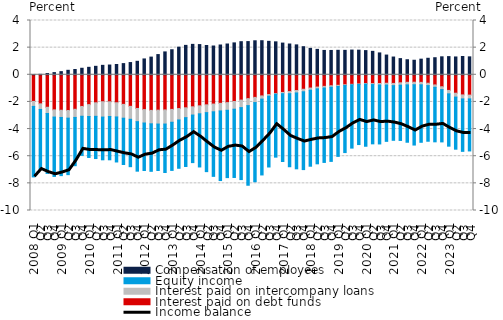
| Category | Interest paid on debt funds | Interest paid on intercompany loans | Equity income | Compensation of employees |
|---|---|---|---|---|
| 2008 Q1 | -1.965 | -0.365 | -5.195 | 0.012 |
| Q2 | -2.142 | -0.413 | -4.421 | 0.031 |
| Q3 | -2.394 | -0.458 | -4.415 | 0.095 |
| Q4 | -2.585 | -0.531 | -4.374 | 0.159 |
| 2009 Q1 | -2.612 | -0.532 | -4.287 | 0.231 |
| Q2 | -2.631 | -0.564 | -4.163 | 0.33 |
| Q3 | -2.543 | -0.6 | -3.555 | 0.388 |
| Q4 | -2.334 | -0.721 | -2.886 | 0.48 |
| 2010 Q1 | -2.199 | -0.875 | -3.018 | 0.55 |
| Q2 | -2.063 | -0.998 | -3.111 | 0.624 |
| Q3 | -1.987 | -1.13 | -3.149 | 0.696 |
| Q4 | -1.991 | -1.081 | -3.192 | 0.719 |
| 2011 Q1 | -2.061 | -1.046 | -3.317 | 0.758 |
| Q2 | -2.18 | -1.02 | -3.411 | 0.824 |
| Q3 | -2.326 | -0.953 | -3.492 | 0.902 |
| Q4 | -2.48 | -0.973 | -3.648 | 0.993 |
| 2012 Q1 | -2.565 | -0.988 | -3.499 | 1.168 |
| Q2 | -2.622 | -0.99 | -3.5 | 1.303 |
| Q3 | -2.606 | -1.024 | -3.421 | 1.489 |
| Q4 | -2.589 | -1.042 | -3.57 | 1.686 |
| 2013 Q1 | -2.551 | -0.948 | -3.547 | 1.844 |
| Q2 | -2.489 | -0.839 | -3.56 | 2.034 |
| Q3 | -2.434 | -0.724 | -3.598 | 2.167 |
| Q4 | -2.359 | -0.607 | -3.505 | 2.241 |
| 2014 Q1 | -2.29 | -0.586 | -3.916 | 2.226 |
| Q2 | -2.215 | -0.573 | -4.348 | 2.16 |
| Q3 | -2.157 | -0.57 | -4.757 | 2.12 |
| Q4 | -2.103 | -0.561 | -5.129 | 2.195 |
| 2015 Q1 | -2.052 | -0.564 | -4.961 | 2.268 |
| Q2 | -1.969 | -0.566 | -5.031 | 2.35 |
| Q3 | -1.866 | -0.554 | -5.302 | 2.439 |
| Q4 | -1.756 | -0.516 | -5.867 | 2.446 |
| 2016 Q1 | -1.666 | -0.381 | -5.836 | 2.506 |
| Q2 | -1.557 | -0.235 | -5.588 | 2.511 |
| Q3 | -1.458 | -0.118 | -5.218 | 2.465 |
| Q4 | -1.386 | -0.041 | -4.642 | 2.428 |
| 2017 Q1 | -1.302 | -0.092 | -4.996 | 2.336 |
| Q2 | -1.239 | -0.155 | -5.382 | 2.268 |
| Q3 | -1.161 | -0.177 | -5.592 | 2.204 |
| Q4 | -1.066 | -0.185 | -5.734 | 2.069 |
| 2018 Q1 | -0.978 | -0.157 | -5.602 | 1.943 |
| Q2 | -0.905 | -0.131 | -5.525 | 1.872 |
| Q3 | -0.854 | -0.122 | -5.482 | 1.794 |
| Q4 | -0.806 | -0.111 | -5.465 | 1.793 |
| 2019 Q1 | -0.775 | -0.09 | -5.148 | 1.804 |
| Q2 | -0.732 | -0.06 | -4.94 | 1.801 |
| Q3 | -0.702 | -0.038 | -4.662 | 1.821 |
| Q4 | -0.675 | -0.033 | -4.433 | 1.815 |
| 2020 Q1 | -0.644 | -0.042 | -4.58 | 1.782 |
| Q2 | -0.65 | -0.069 | -4.369 | 1.727 |
| Q3 | -0.643 | -0.108 | -4.345 | 1.611 |
| Q4 | -0.624 | -0.131 | -4.151 | 1.454 |
| 2021 Q1 | -0.637 | -0.163 | -4.028 | 1.308 |
| Q2 | -0.591 | -0.174 | -4.073 | 1.192 |
| Q3 | -0.554 | -0.187 | -4.229 | 1.109 |
| Q4 | -0.548 | -0.184 | -4.445 | 1.071 |
| 2022 Q1 | -0.559 | -0.179 | -4.236 | 1.151 |
| Q2 | -0.623 | -0.174 | -4.1 | 1.217 |
| Q3 | -0.747 | -0.174 | -4.019 | 1.257 |
| Q4 | -0.881 | -0.21 | -3.854 | 1.324 |
| 2023 Q1 | -1.153 | -0.253 | -3.854 | 1.339 |
| Q2 | -1.357 | -0.285 | -3.84 | 1.313 |
| Q3 | -1.483 | -0.294 | -3.864 | 1.348 |
| Q4 | -1.498 | -0.279 | -3.835 | 1.321 |